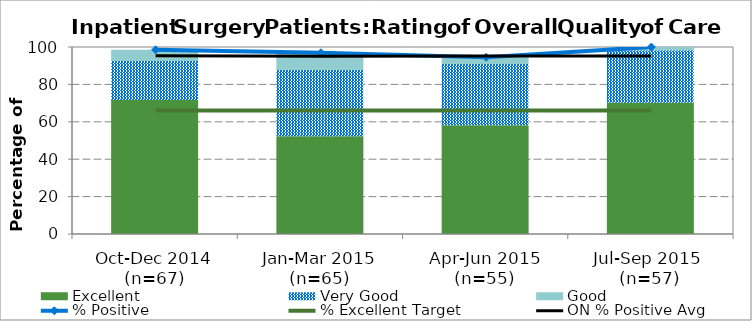
| Category | Excellent | Very Good | Good |
|---|---|---|---|
| Oct-Dec 2014 (n=67) | 71.64 | 20.9 | 5.97 |
| Jan-Mar 2015 (n=65) | 52.3 | 35.4 | 9.2 |
| Apr-Jun 2015 (n=55) | 58.2 | 32.7 | 3.6 |
| Jul-Sep 2015 
(n=57) | 70.18 | 28.07 | 1.75 |